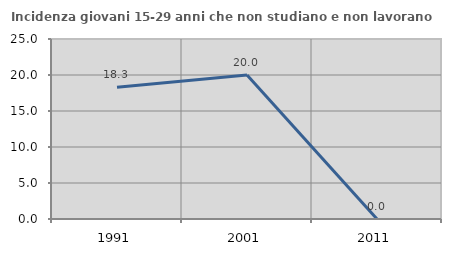
| Category | Incidenza giovani 15-29 anni che non studiano e non lavorano  |
|---|---|
| 1991.0 | 18.31 |
| 2001.0 | 20 |
| 2011.0 | 0 |